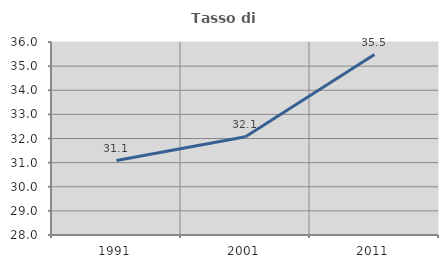
| Category | Tasso di occupazione   |
|---|---|
| 1991.0 | 31.087 |
| 2001.0 | 32.071 |
| 2011.0 | 35.48 |